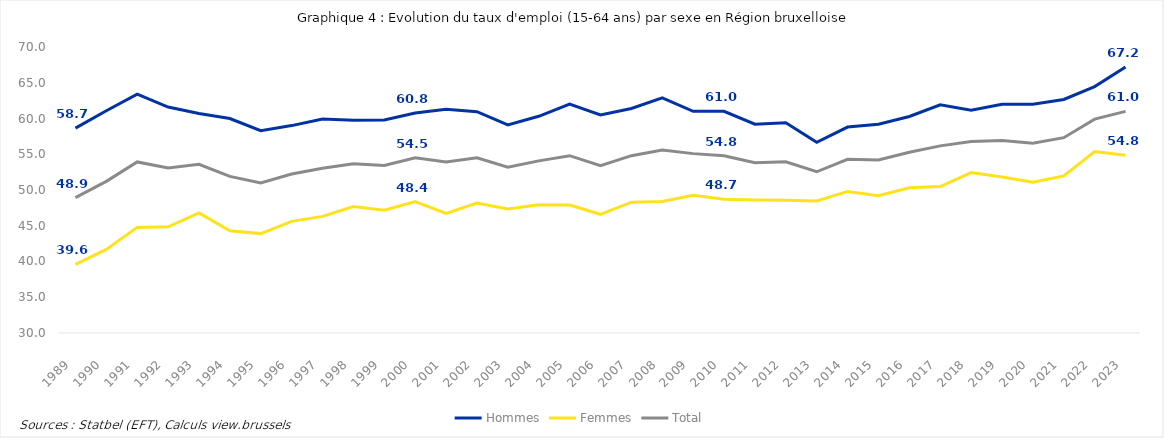
| Category | Hommes | Femmes | Total |
|---|---|---|---|
| 1989.0 | 58.651 | 39.606 | 48.934 |
| 1990.0 | 61.08 | 41.692 | 51.204 |
| 1991.0 | 63.417 | 44.77 | 53.927 |
| 1992.0 | 61.596 | 44.844 | 53.078 |
| 1993.0 | 60.7 | 46.8 | 53.6 |
| 1994.0 | 60 | 44.3 | 51.9 |
| 1995.0 | 58.3 | 43.9 | 51 |
| 1996.0 | 59.008 | 45.612 | 52.231 |
| 1997.0 | 59.93 | 46.308 | 53.039 |
| 1998.0 | 59.751 | 47.696 | 53.656 |
| 1999.0 | 59.797 | 47.185 | 53.427 |
| 2000.0 | 60.781 | 48.381 | 54.514 |
| 2001.0 | 61.277 | 46.71 | 53.924 |
| 2002.0 | 60.948 | 48.169 | 54.505 |
| 2003.0 | 59.11 | 47.355 | 53.194 |
| 2004.0 | 60.305 | 47.938 | 54.071 |
| 2005.0 | 62 | 47.9 | 54.8 |
| 2006.0 | 60.5 | 46.6 | 53.4 |
| 2007.0 | 61.4 | 48.3 | 54.8 |
| 2008.0 | 62.9 | 48.4 | 55.6 |
| 2009.0 | 61.01 | 49.259 | 55.088 |
| 2010.0 | 61 | 48.7 | 54.8 |
| 2011.0 | 59.2 | 48.6 | 53.8 |
| 2012.0 | 59.417 | 48.562 | 53.956 |
| 2013.0 | 56.679 | 48.465 | 52.549 |
| 2014.0 | 58.8 | 49.8 | 54.3 |
| 2015.0 | 59.2 | 49.2 | 54.2 |
| 2016.0 | 60.277 | 50.301 | 55.271 |
| 2017.0 | 61.905 | 50.483 | 56.173 |
| 2018.0 | 61.168 | 52.432 | 56.794 |
| 2019.0 | 62.006 | 51.822 | 56.912 |
| 2020.0 | 62.008 | 51.091 | 56.55 |
| 2021.0 | 62.66 | 51.967 | 57.316 |
| 2022.0 | 64.457 | 55.377 | 59.908 |
| 2023.0 | 67.196 | 54.846 | 60.999 |